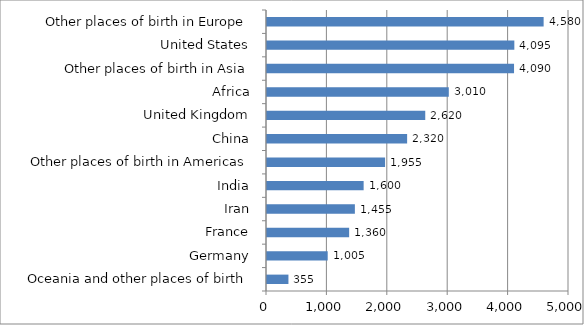
| Category | Series 0 |
|---|---|
|     Oceania and other places of birth | 355 |
|     Germany | 1005 |
|     France | 1360 |
|     Iran | 1455 |
|     India | 1600 |
|     Other places of birth in Americas | 1955 |
|     China | 2320 |
|     United Kingdom | 2620 |
|     Africa | 3010 |
|     Other places of birth in Asia | 4090 |
|     United States | 4095 |
|     Other places of birth in Europe | 4580 |